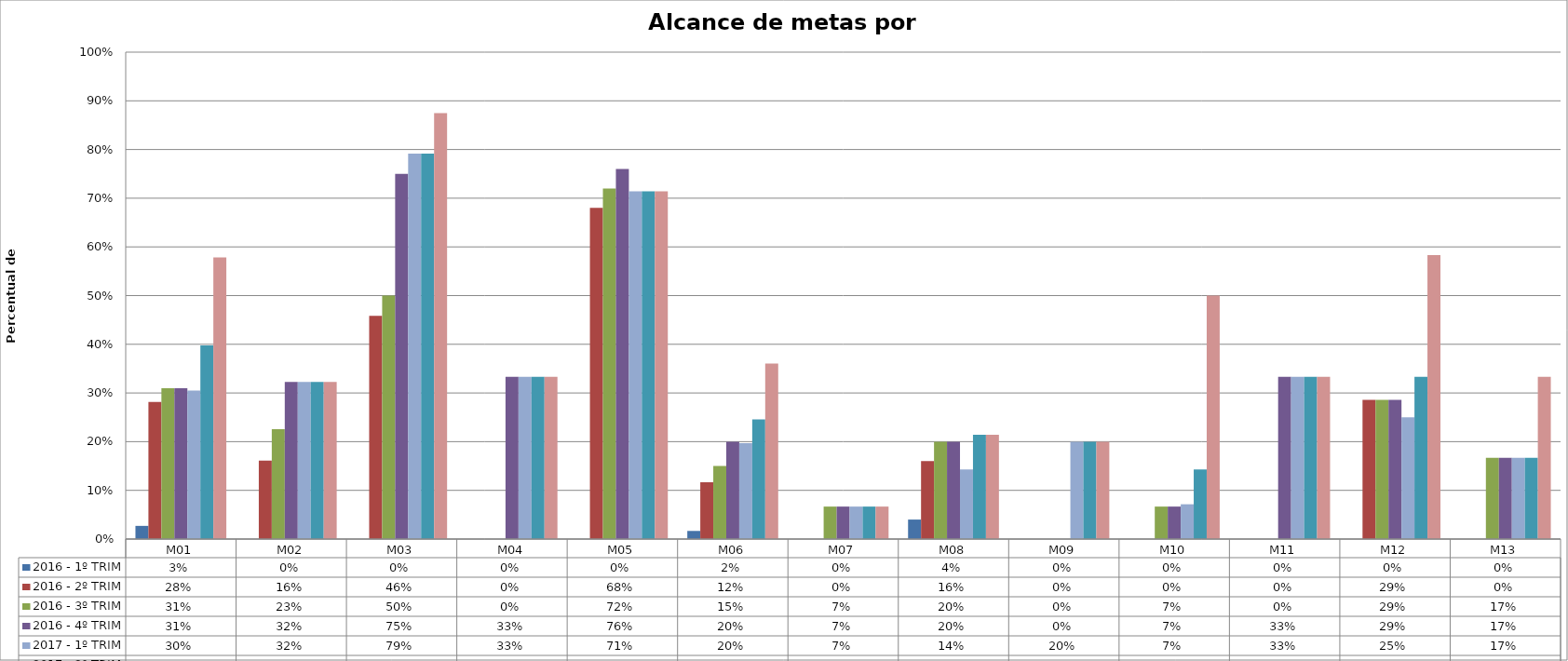
| Category | 2016 - 1º TRIM | 2016 - 2º TRIM | 2016 - 3º TRIM | 2016 - 4º TRIM | 2017 - 1º TRIM | 2017 - 2º TRIM | 2017 - 3º TRIM |
|---|---|---|---|---|---|---|---|
| M01 | 0.027 | 0.282 | 0.31 | 0.31 | 0.305 | 0.398 | 0.578 |
| M02 | 0 | 0.161 | 0.226 | 0.323 | 0.323 | 0.323 | 0.323 |
| M03 | 0 | 0.458 | 0.5 | 0.75 | 0.792 | 0.792 | 0.875 |
| M04 | 0 | 0 | 0 | 0.333 | 0.333 | 0.333 | 0.333 |
| M05 | 0 | 0.68 | 0.72 | 0.76 | 0.714 | 0.714 | 0.714 |
| M06 | 0.017 | 0.117 | 0.15 | 0.2 | 0.197 | 0.246 | 0.361 |
| M07 | 0 | 0 | 0.067 | 0.067 | 0.067 | 0.067 | 0.067 |
| M08 | 0.04 | 0.16 | 0.2 | 0.2 | 0.143 | 0.214 | 0.214 |
| M09 | 0 | 0 | 0 | 0 | 0.2 | 0.2 | 0.2 |
| M10 | 0 | 0 | 0.067 | 0.067 | 0.071 | 0.143 | 0.5 |
| M11 | 0 | 0 | 0 | 0.333 | 0.333 | 0.333 | 0.333 |
| M12 | 0 | 0.286 | 0.286 | 0.286 | 0.25 | 0.333 | 0.583 |
| M13 | 0 | 0 | 0.167 | 0.167 | 0.167 | 0.167 | 0.333 |